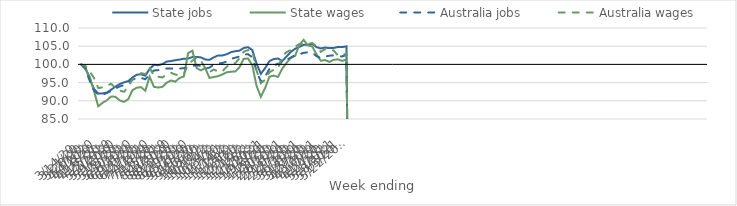
| Category | State jobs | State wages | Australia jobs | Australia wages |
|---|---|---|---|---|
| 14/03/2020 | 100 | 100 | 100 | 100 |
| 21/03/2020 | 99.176 | 98.603 | 98.971 | 99.605 |
| 28/03/2020 | 95.99 | 96.658 | 95.467 | 98.107 |
| 04/04/2020 | 93.279 | 92.668 | 92.92 | 96.258 |
| 11/04/2020 | 91.986 | 88.491 | 91.648 | 93.491 |
| 18/04/2020 | 92.033 | 89.453 | 91.631 | 93.694 |
| 25/04/2020 | 92.256 | 90.11 | 92.162 | 94.113 |
| 02/05/2020 | 93.042 | 91.22 | 92.658 | 94.675 |
| 09/05/2020 | 93.881 | 91.088 | 93.343 | 93.583 |
| 16/05/2020 | 94.588 | 90.143 | 93.936 | 92.817 |
| 23/05/2020 | 95.073 | 89.715 | 94.293 | 92.47 |
| 30/05/2020 | 95.397 | 90.425 | 94.8 | 93.82 |
| 06/06/2020 | 96.411 | 92.925 | 95.784 | 95.934 |
| 13/06/2020 | 97.162 | 93.592 | 96.283 | 96.613 |
| 20/06/2020 | 97.276 | 93.745 | 96.299 | 97.596 |
| 27/06/2020 | 96.909 | 92.768 | 95.908 | 97.351 |
| 04/07/2020 | 98.755 | 96.626 | 97.201 | 99.182 |
| 11/07/2020 | 99.889 | 93.853 | 98.328 | 96.791 |
| 18/07/2020 | 99.759 | 93.639 | 98.432 | 96.609 |
| 25/07/2020 | 100.099 | 93.824 | 98.653 | 96.408 |
| 01/08/2020 | 100.78 | 94.973 | 98.875 | 97.263 |
| 08/08/2020 | 100.915 | 95.59 | 98.872 | 97.698 |
| 15/08/2020 | 101.159 | 95.255 | 98.757 | 97.212 |
| 22/08/2020 | 101.311 | 96.258 | 98.844 | 97.073 |
| 29/08/2020 | 101.559 | 96.69 | 98.982 | 97.295 |
| 05/09/2020 | 101.605 | 103.088 | 99.167 | 100.035 |
| 12/09/2020 | 102.008 | 103.784 | 99.586 | 101.016 |
| 19/09/2020 | 102.054 | 98.982 | 99.757 | 101.878 |
| 26/09/2020 | 101.919 | 98.36 | 99.556 | 101.032 |
| 03/10/2020 | 101.343 | 98.985 | 98.852 | 98.907 |
| 10/10/2020 | 101.255 | 96.281 | 99.105 | 97.892 |
| 17/10/2020 | 101.921 | 96.531 | 99.955 | 98.589 |
| 24/10/2020 | 102.467 | 96.777 | 100.247 | 98.012 |
| 31/10/2020 | 102.455 | 97.239 | 100.384 | 98.084 |
| 07/11/2020 | 102.785 | 97.815 | 100.771 | 99.334 |
| 14/11/2020 | 103.365 | 97.986 | 101.516 | 100.252 |
| 21/11/2020 | 103.62 | 98.057 | 101.84 | 100.323 |
| 28/11/2020 | 103.778 | 99.165 | 102.16 | 101.68 |
| 05/12/2020 | 104.506 | 101.52 | 102.718 | 103.493 |
| 12/12/2020 | 104.729 | 101.63 | 102.789 | 103.93 |
| 19/12/2020 | 103.961 | 99.788 | 101.986 | 103.809 |
| 26/12/2020 | 100.216 | 94.078 | 98.188 | 98.338 |
| 02/01/2021 | 97.404 | 91.115 | 95.282 | 94.812 |
| 09/01/2021 | 98.993 | 93.53 | 96.645 | 95.793 |
| 16/01/2021 | 100.9 | 96.627 | 98.738 | 97.83 |
| 23/01/2021 | 101.45 | 96.923 | 99.703 | 98.519 |
| 30/01/2021 | 101.631 | 96.555 | 100.182 | 98.873 |
| 06/02/2021 | 100.911 | 98.82 | 100.516 | 102.171 |
| 13/02/2021 | 102.165 | 100.404 | 101.256 | 103.38 |
| 20/02/2021 | 103.44 | 101.812 | 101.855 | 103.943 |
| 27/02/2021 | 104.28 | 102.319 | 102.556 | 104.829 |
| 06/03/2021 | 104.804 | 105.374 | 102.809 | 105.611 |
| 13/03/2021 | 105.366 | 106.751 | 103.171 | 105.63 |
| 20/03/2021 | 105.42 | 105.203 | 103.339 | 105.616 |
| 27/03/2021 | 105.607 | 104.936 | 103.246 | 105.876 |
| 03/04/2021 | 104.751 | 102.788 | 102.251 | 104.958 |
| 10/04/2021 | 104.386 | 100.998 | 101.76 | 103.45 |
| 17/04/2021 | 104.623 | 101.2 | 102.161 | 104.184 |
| 24/04/2021 | 104.469 | 100.69 | 102.386 | 103.705 |
| 01/05/2021 | 104.496 | 101.239 | 102.495 | 103.842 |
| 08/05/2021 | 104.8 | 101.401 | 102.264 | 102.466 |
| 15/05/2021 | 104.756 | 100.976 | 102.191 | 102.371 |
| 22/05/2021 | 104.951 | 101.316 | 102.592 | 103.091 |